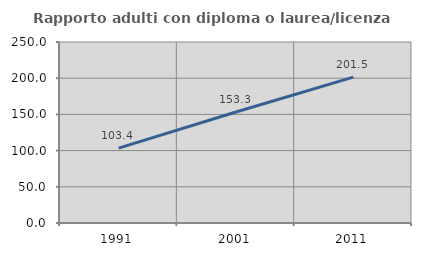
| Category | Rapporto adulti con diploma o laurea/licenza media  |
|---|---|
| 1991.0 | 103.436 |
| 2001.0 | 153.312 |
| 2011.0 | 201.494 |